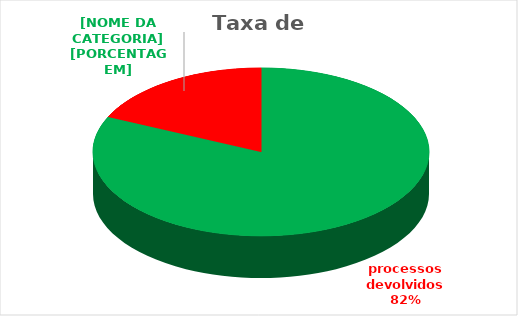
| Category | Series 0 |
|---|---|
| processos devolvidos  | 9 |
| processos em atendimento  | 2 |